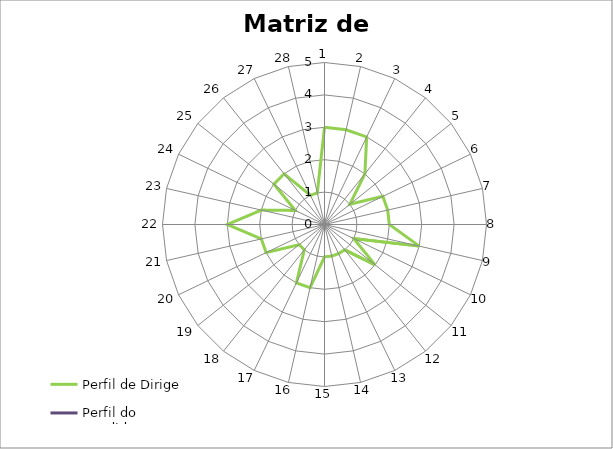
| Category | Perfil de Dirigente | Perfil do Candidato |
|---|---|---|
| 0 | 3 | 0 |
| 1 | 3 | 0 |
| 2 | 3 | 0 |
| 3 | 2 | 0 |
| 4 | 1 | 0 |
| 5 | 2 | 0 |
| 6 | 2 | 0 |
| 7 | 2 | 0 |
| 8 | 3 | 0 |
| 9 | 1 | 0 |
| 10 | 2 | 0 |
| 11 | 1 | 0 |
| 12 | 1 | 0 |
| 13 | 1 | 0 |
| 14 | 1 | 0 |
| 15 | 2 | 0 |
| 16 | 2 | 0 |
| 17 | 1 | 0 |
| 18 | 1 | 0 |
| 19 | 2 | 0 |
| 20 | 2 | 0 |
| 21 | 3 | 0 |
| 22 | 2 | 0 |
| 23 | 1 | 0 |
| 24 | 2 | 0 |
| 25 | 2 | 0 |
| 26 | 1 | 0 |
| 27 | 1 | 0 |